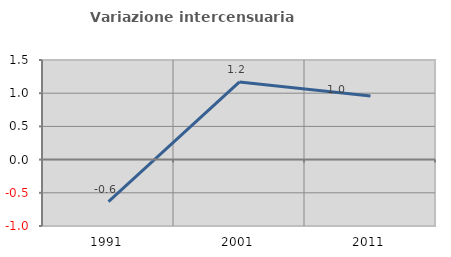
| Category | Variazione intercensuaria annua |
|---|---|
| 1991.0 | -0.633 |
| 2001.0 | 1.169 |
| 2011.0 | 0.958 |